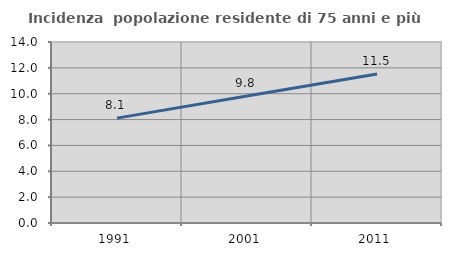
| Category | Incidenza  popolazione residente di 75 anni e più |
|---|---|
| 1991.0 | 8.11 |
| 2001.0 | 9.817 |
| 2011.0 | 11.522 |